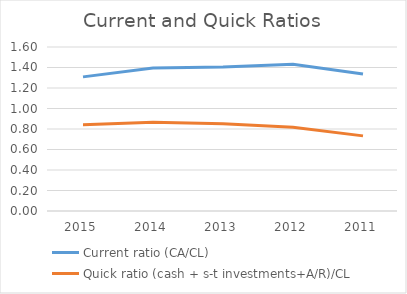
| Category | Current ratio (CA/CL) | Quick ratio (cash + s-t investments+A/R)/CL |
|---|---|---|
| 2015.0 | 1.309 | 0.842 |
| 2014.0 | 1.394 | 0.865 |
| 2013.0 | 1.404 | 0.852 |
| 2012.0 | 1.433 | 0.818 |
| 2011.0 | 1.337 | 0.733 |